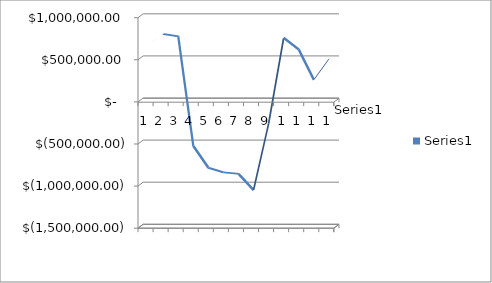
| Category | Series 0 |
|---|---|
| 0 | 639577.91 |
| 1 | 772484.34 |
| 2 | 744221.09 |
| 3 | -556986.32 |
| 4 | -816542.71 |
| 5 | -871408.3 |
| 6 | -888437.01 |
| 7 | -1081861.33 |
| 8 | -292264.23 |
| 9 | 726975.86 |
| 10 | 588004.38 |
| 11 | 228512.77 |
| 12 | 474791.17 |